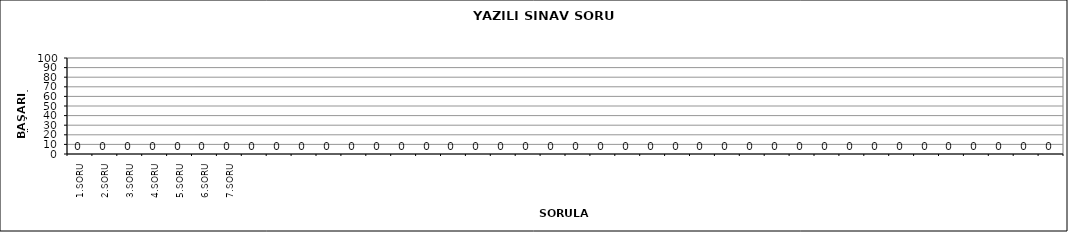
| Category | Series 0 |
|---|---|
| 1.SORU | 0 |
| 2.SORU | 0 |
| 3.SORU | 0 |
| 4.SORU | 0 |
| 5.SORU | 0 |
| 6.SORU | 0 |
| 7.SORU | 0 |
|   | 0 |
|   | 0 |
|   | 0 |
|   | 0 |
|   | 0 |
|   | 0 |
|   | 0 |
|   | 0 |
|   | 0 |
|   | 0 |
|   | 0 |
|   | 0 |
|   | 0 |
|   | 0 |
|   | 0 |
|   | 0 |
|   | 0 |
|   | 0 |
|   | 0 |
|   | 0 |
|   | 0 |
|   | 0 |
|   | 0 |
|   | 0 |
|   | 0 |
|   | 0 |
|   | 0 |
|   | 0 |
|   | 0 |
|   | 0 |
|   | 0 |
|   | 0 |
|   | 0 |